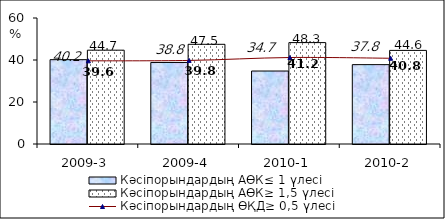
| Category | Кәсіпорындардың АӨК≤ 1 үлесі | Кәсіпорындардың АӨК≥ 1,5 үлесі |
|---|---|---|
| 2009-3 | 40.161 | 44.677 |
| 2009-4 | 38.825 | 47.471 |
| 2010-1 | 34.747 | 48.287 |
| 2010-2 | 37.793 | 44.574 |